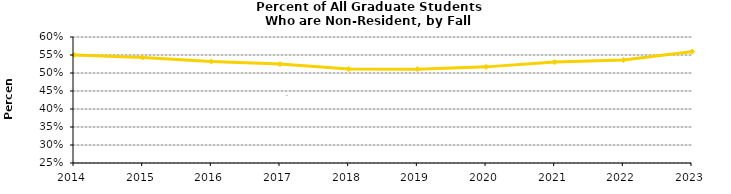
| Category | Percent Non-Resident |
|---|---|
| 2014.0 | 0.55 |
| 2015.0 | 0.543 |
| 2016.0 | 0.532 |
| 2017.0 | 0.525 |
| 2018.0 | 0.511 |
| 2019.0 | 0.511 |
| 2020.0 | 0.517 |
| 2021.0 | 0.53 |
| 2022.0 | 0.536 |
| 2023.0 | 0.559 |